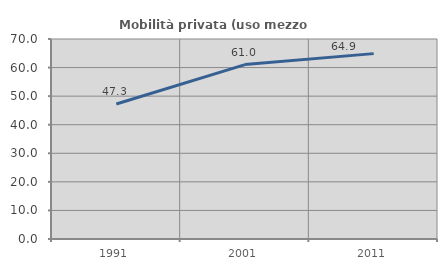
| Category | Mobilità privata (uso mezzo privato) |
|---|---|
| 1991.0 | 47.251 |
| 2001.0 | 61.038 |
| 2011.0 | 64.88 |